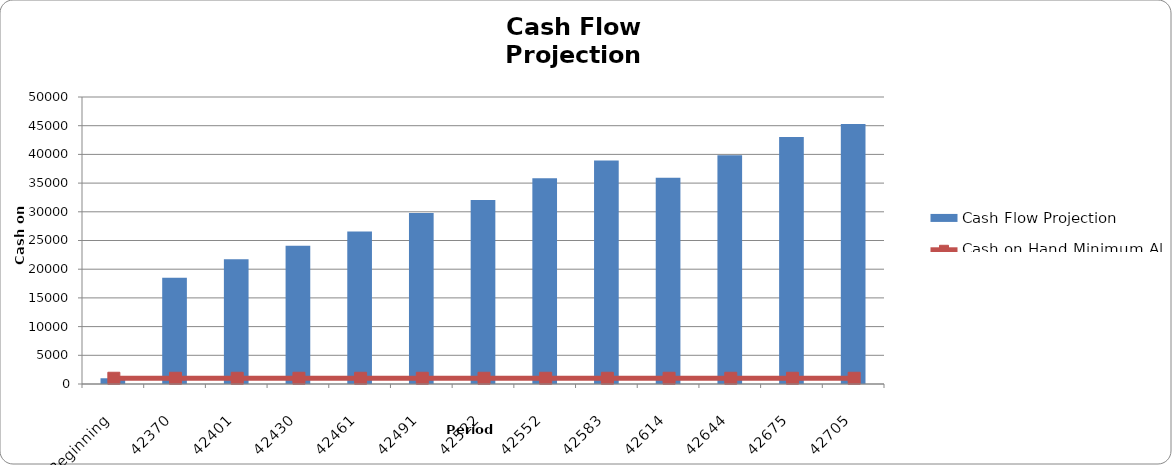
| Category | Cash Flow Projection |
|---|---|
| Beginning | 1000 |
| 42370 | 18510 |
| 42401 | 21744.5 |
| 42430 | 24081.5 |
| 42461 | 26549.5 |
| 42491 | 29797.1 |
| 42522 | 32058.1 |
| 42552 | 35848.1 |
| 42583 | 38948.1 |
| 42614 | 35953.6 |
| 42644 | 39833.6 |
| 42675 | 43023.6 |
| 42705 | 45316.6 |